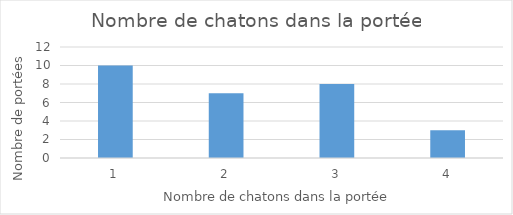
| Category | Series 0 |
|---|---|
| 1.0 | 10 |
| 2.0 | 7 |
| 3.0 | 8 |
| 4.0 | 3 |